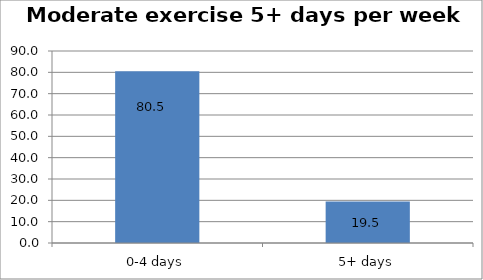
| Category | Series 0 |
|---|---|
| 0-4 days | 80.521 |
| 5+ days | 19.479 |